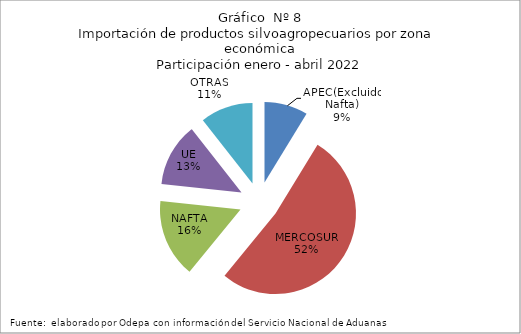
| Category | Series 0 |
|---|---|
| APEC(Excluido Nafta) | 274930.228 |
| MERCOSUR | 1639959.568 |
| NAFTA | 495973.033 |
| UE | 400145.134 |
| OTRAS | 332579.037 |